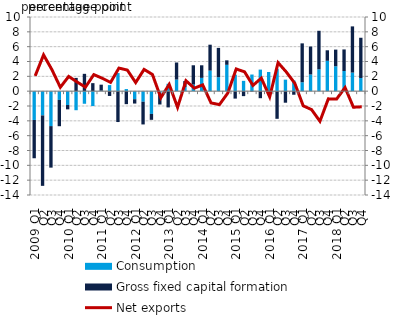
| Category | Consumption | Gross fixed capital formation |
|---|---|---|
| 2009 Q1 | -3.884 | -5.162 |
| Q2 | -3.27 | -9.496 |
| Q3 | -4.712 | -5.598 |
| Q4 | -1.173 | -3.553 |
| 2010 Q1 | -1.869 | -0.582 |
| Q2 | -2.568 | 1.789 |
| Q3 | -1.697 | 2.337 |
| Q4 | -2.007 | 1.081 |
| 2011 Q1 | 0.064 | 0.812 |
| Q2 | 0.82 | -0.646 |
| Q3 | 2.441 | -4.163 |
| Q4 | 0.284 | -1.75 |
| 2012 Q1 | -1.086 | -0.584 |
| Q2 | -1.425 | -3.061 |
| Q3 | -3.065 | -0.799 |
| Q4 | -0.219 | -1.578 |
| 2013 Q1 | 1.001 | -2.188 |
| Q2 | 1.563 | 2.302 |
| Q3 | 0.572 | 0.788 |
| Q4 | 0.889 | 2.603 |
| 2014 Q1 | 1.794 | 1.696 |
| Q2 | 2.772 | 3.495 |
| Q3 | 1.885 | 3.949 |
| Q4 | 3.552 | 0.605 |
| 2015 Q1 | 2.225 | -1.001 |
| Q2 | 1.39 | -0.669 |
| Q3 | 2.244 | -0.069 |
| Q4 | 2.908 | -0.948 |
| 2016 Q1 | 2.588 | -0.462 |
| Q2 | 3.019 | -3.727 |
| Q3 | 1.551 | -1.557 |
| Q4 | 1.434 | -0.482 |
| 2017 Q1 | 1.203 | 5.242 |
| Q2 | 2.251 | 3.764 |
| Q3 | 2.947 | 5.195 |
| Q4 | 4.097 | 1.416 |
| 2018 Q1 | 3.359 | 2.244 |
| Q2 | 2.718 | 2.908 |
| Q3 | 2.507 | 6.227 |
| Q4 | 1.77 | 5.431 |